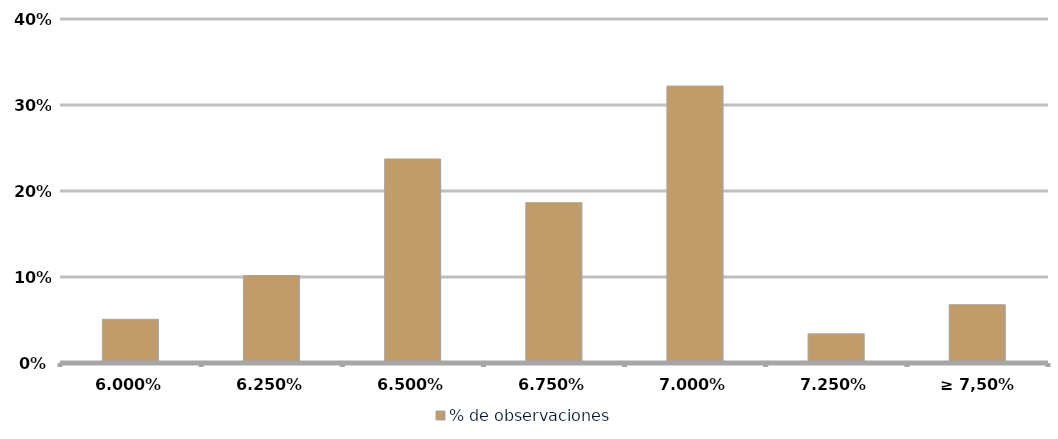
| Category | % de observaciones  |
|---|---|
| 6.00% | 0.051 |
| 6.25% | 0.102 |
| 6.50% | 0.237 |
| 6.75% | 0.186 |
| 7.00% | 0.322 |
| 7.25% | 0.034 |
| ≥ 7,50% | 0.068 |